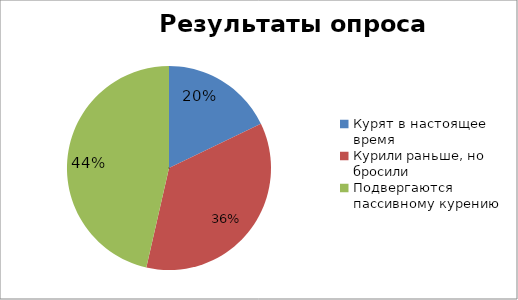
| Category | Series 0 |
|---|---|
| Курят в настоящее время | 0.25 |
| Курили раньше, но бросили | 0.5 |
| Подвергаются пассивному курению | 0.65 |